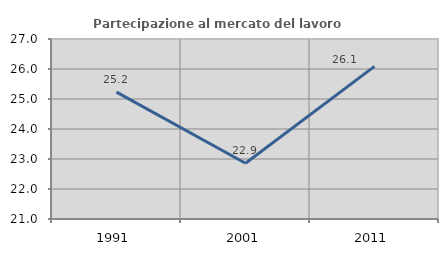
| Category | Partecipazione al mercato del lavoro  femminile |
|---|---|
| 1991.0 | 25.228 |
| 2001.0 | 22.857 |
| 2011.0 | 26.087 |